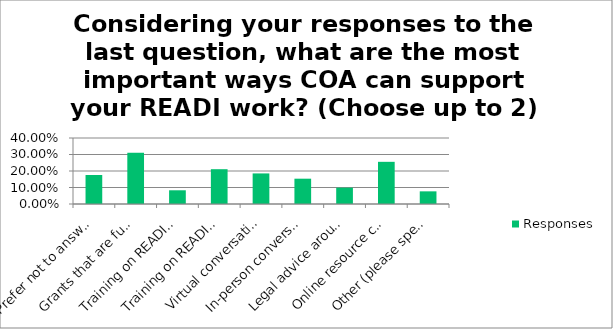
| Category | Responses |
|---|---|
| Prefer not to answer | 0.176 |
| Grants that are fully or partially scored based on arts and equity, access, diversity and inclusion | 0.31 |
| Training on READI components- in person | 0.083 |
| Training on READI components- via webinar | 0.211 |
| Virtual conversations with artists/art organizations doing excellent READI programming | 0.185 |
| In-person conversations with artists/art organizations doing excellent READI programming | 0.153 |
| Legal advice around Equal opportunity and non-discrimination laws | 0.099 |
| Online resource center to share READI resources | 0.256 |
| Other (please specify) | 0.077 |